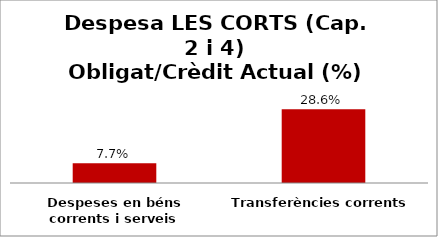
| Category | Series 0 |
|---|---|
| Despeses en béns corrents i serveis | 0.077 |
| Transferències corrents | 0.286 |